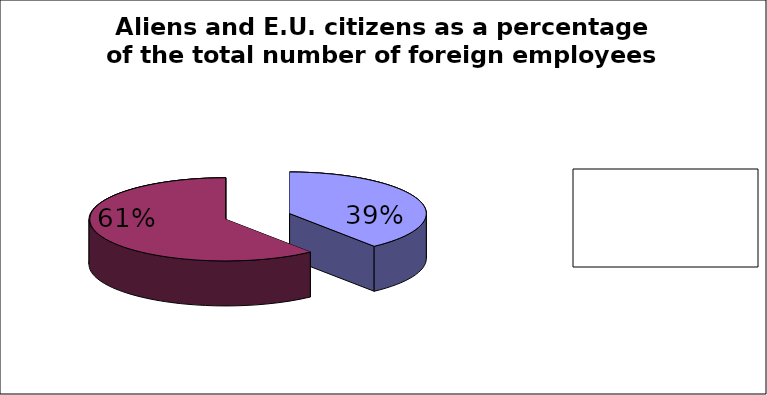
| Category | Series 0 |
|---|---|
| Aliens | 58287.75 |
| E.U. citizens | 89719.25 |